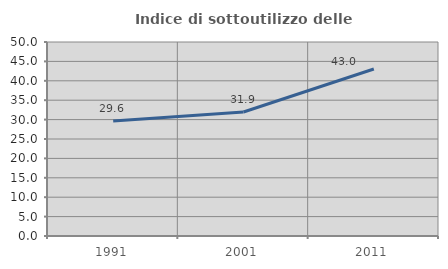
| Category | Indice di sottoutilizzo delle abitazioni  |
|---|---|
| 1991.0 | 29.637 |
| 2001.0 | 31.949 |
| 2011.0 | 43.046 |